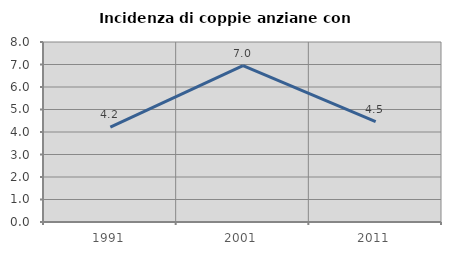
| Category | Incidenza di coppie anziane con figli |
|---|---|
| 1991.0 | 4.213 |
| 2001.0 | 6.952 |
| 2011.0 | 4.457 |